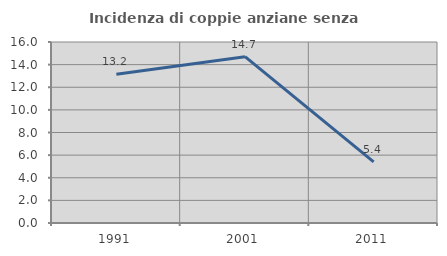
| Category | Incidenza di coppie anziane senza figli  |
|---|---|
| 1991.0 | 13.158 |
| 2001.0 | 14.706 |
| 2011.0 | 5.405 |